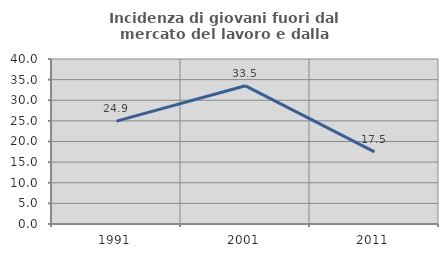
| Category | Incidenza di giovani fuori dal mercato del lavoro e dalla formazione  |
|---|---|
| 1991.0 | 24.949 |
| 2001.0 | 33.504 |
| 2011.0 | 17.486 |